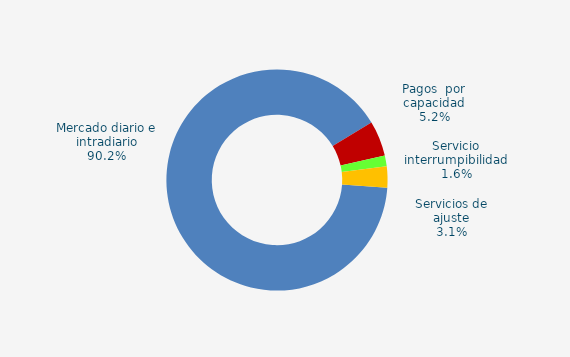
| Category | Series 0 |
|---|---|
| Mercado diario e intradiario | 43.57 |
| Pagos  por capacidad | 2.49 |
| Servicio interrumpibilidad | 0.77 |
| Servicios de ajuste | 1.49 |